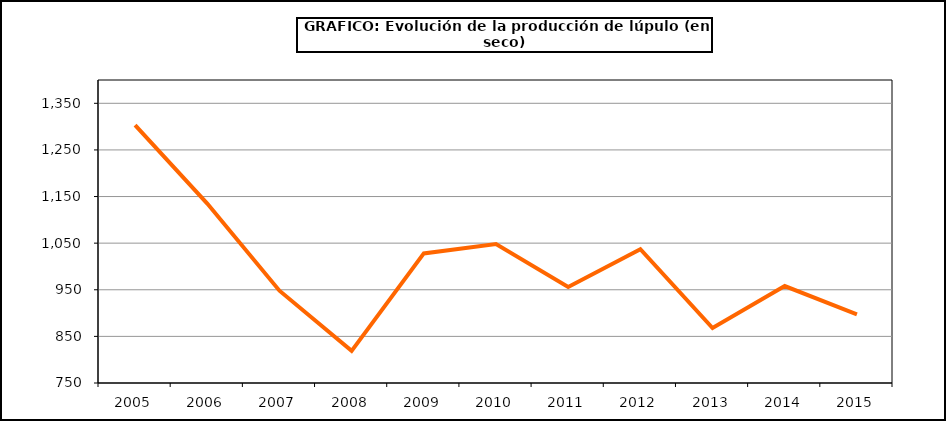
| Category | Superficie |
|---|---|
| 2005.0 | 1303 |
| 2006.0 | 1135 |
| 2007.0 | 948 |
| 2008.0 | 819 |
| 2009.0 | 1028 |
| 2010.0 | 1048 |
| 2011.0 | 956 |
| 2012.0 | 1037 |
| 2013.0 | 868 |
| 2014.0 | 958 |
| 2015.0 | 897 |